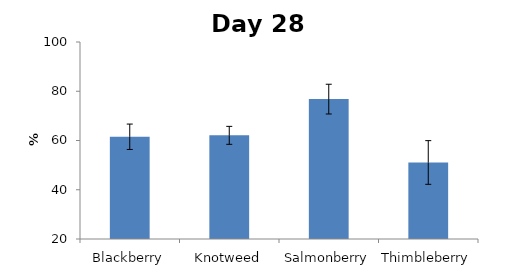
| Category | Series 0 |
|---|---|
| Blackberry | 61.517 |
| Knotweed | 62.094 |
| Salmonberry | 76.804 |
| Thimbleberry | 51.076 |